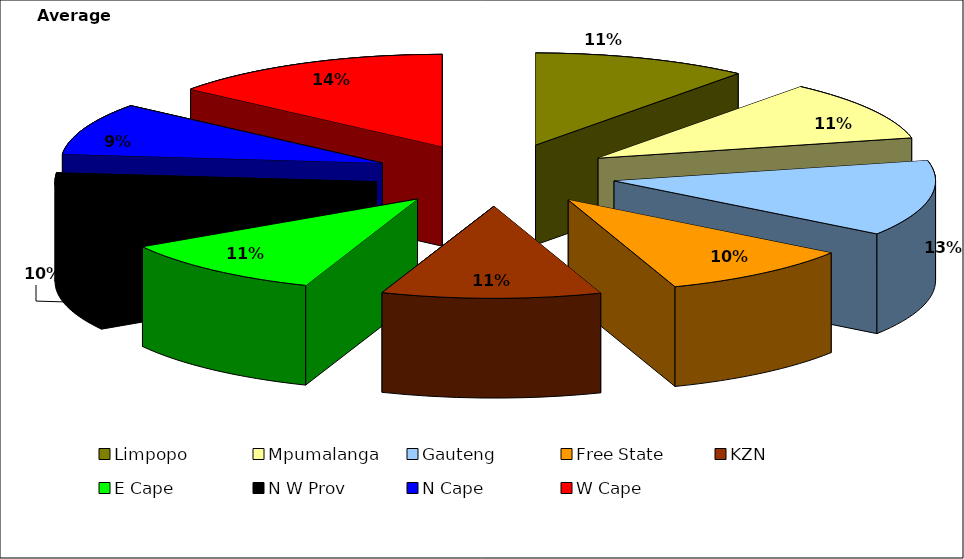
| Category | Average 2009 |
|---|---|
| Limpopo | 830049.275 |
| Mpumalanga | 811202.35 |
| Gauteng | 1017387.025 |
| Free State | 753211.45 |
| KZN | 844989.075 |
| E Cape | 816785.425 |
| N W Prov | 781029.875 |
| N Cape | 699720.2 |
| W Cape | 1093783.55 |